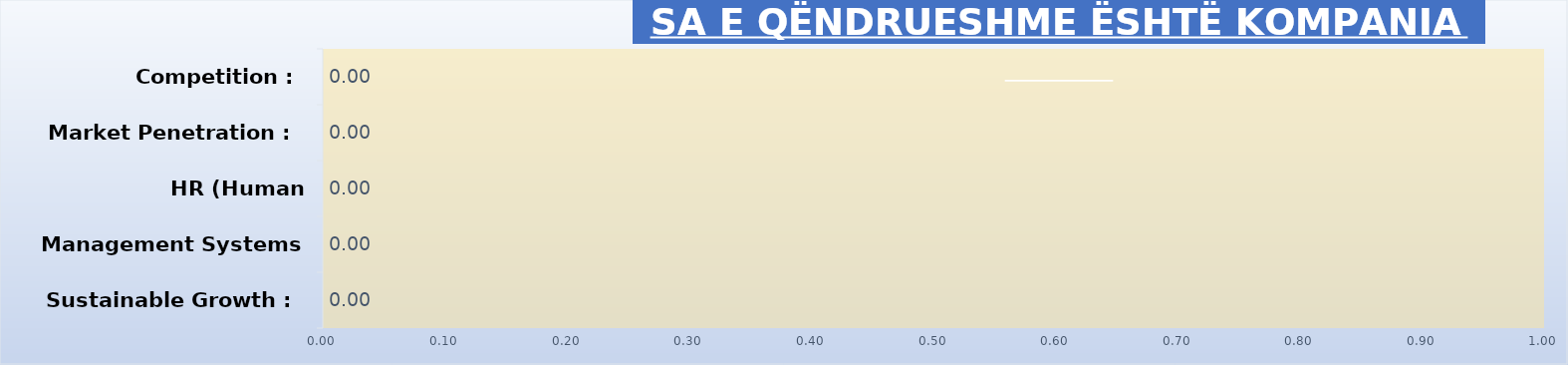
| Category | Series 0 |
|---|---|
| Sustainable Growth : | 0 |
| Management Systems : | 0 |
| HR (Human Resources) : | 0 |
| Market Penetration : | 0 |
| Competition : | 0 |